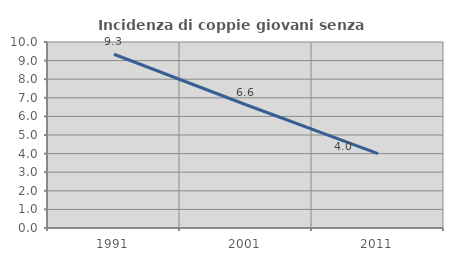
| Category | Incidenza di coppie giovani senza figli |
|---|---|
| 1991.0 | 9.343 |
| 2001.0 | 6.627 |
| 2011.0 | 4 |